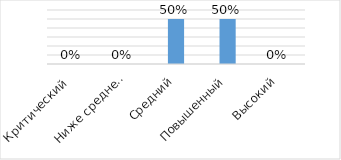
| Category | Series 0 |
|---|---|
| Критический  | 0 |
| Ниже среднего | 0 |
| Средний | 0.5 |
| Повышенный | 0.5 |
| Высокий | 0 |